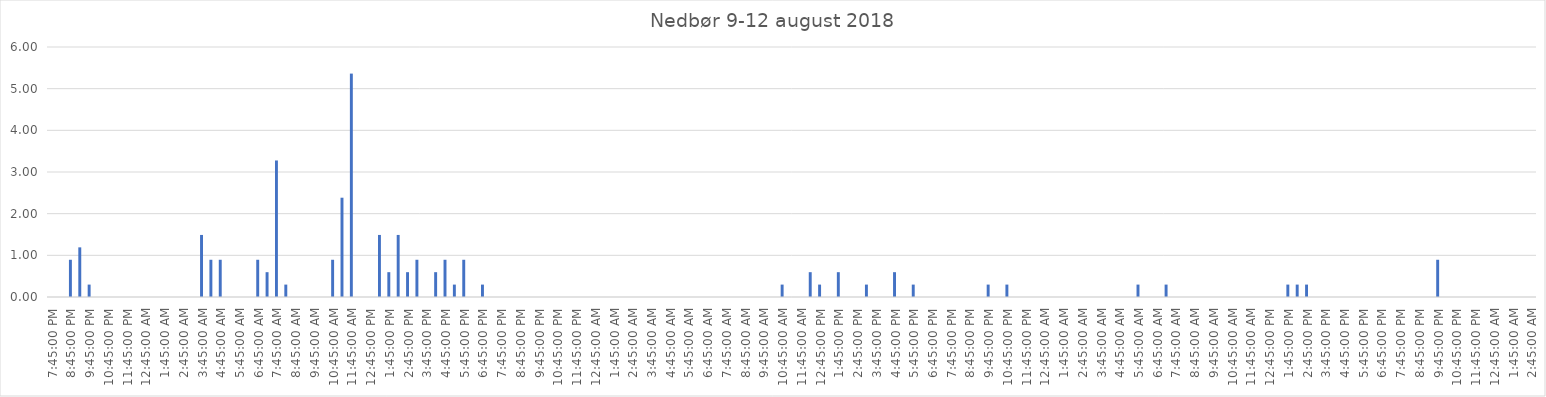
| Category | Series 0 |
|---|---|
| 0.8229166666666666 | 0 |
| 0.84375 | 0 |
| 0.8645833333333334 | 0.894 |
| 0.8854166666666667 | 1.191 |
| 0.9062500000000001 | 0.298 |
| 0.9270833333333335 | 0 |
| 0.9479166666666669 | 0 |
| 0.9687500000000002 | 0 |
| 0.9895833333333336 | 0 |
| 1900-01-01 00:15:00 | 0 |
| 1900-01-01 00:45:00 | 0 |
| 1900-01-01 01:15:00 | 0 |
| 1900-01-01 01:45:00 | 0 |
| 1900-01-01 02:15:00 | 0 |
| 1900-01-01 02:45:00 | 0 |
| 1900-01-01 03:15:00 | 0 |
| 1900-01-01 03:45:00 | 1.489 |
| 1900-01-01 04:15:00 | 0.894 |
| 1900-01-01 04:45:00 | 0.894 |
| 1900-01-01 05:15:00 | 0 |
| 1900-01-01 05:45:00 | 0 |
| 1900-01-01 06:15:00 | 0 |
| 1900-01-01 06:45:00 | 0.894 |
| 1900-01-01 07:15:00 | 0.596 |
| 1900-01-01 07:45:00 | 3.277 |
| 1900-01-01 08:15:00 | 0.298 |
| 1900-01-01 08:45:00 | 0 |
| 1900-01-01 09:15:00 | 0 |
| 1900-01-01 09:45:00 | 0 |
| 1900-01-01 10:15:00 | 0 |
| 1900-01-01 10:45:00 | 0.894 |
| 1900-01-01 11:15:00 | 2.383 |
| 1900-01-01 11:45:00 | 5.362 |
| 1900-01-01 12:15:00 | 0 |
| 1900-01-01 12:45:00 | 0 |
| 1900-01-01 13:15:00 | 1.489 |
| 1900-01-01 13:45:00 | 0.596 |
| 1900-01-01 14:15:00 | 1.489 |
| 1900-01-01 14:45:00 | 0.596 |
| 1900-01-01 15:15:00 | 0.894 |
| 1900-01-01 15:45:00 | 0 |
| 1900-01-01 16:15:00 | 0.596 |
| 1900-01-01 16:45:00 | 0.894 |
| 1900-01-01 17:15:00 | 0.298 |
| 1900-01-01 17:45:00 | 0.894 |
| 1900-01-01 18:15:00 | 0 |
| 1900-01-01 18:45:00 | 0.298 |
| 1900-01-01 19:15:00 | 0 |
| 1900-01-01 19:45:00 | 0 |
| 1900-01-01 20:15:00 | 0 |
| 1900-01-01 20:45:00 | 0 |
| 1900-01-01 21:15:00 | 0 |
| 1900-01-01 21:45:00 | 0 |
| 1900-01-01 22:15:00 | 0 |
| 1900-01-01 22:45:00 | 0 |
| 1900-01-01 23:15:00 | 0 |
| 1900-01-01 23:45:00 | 0 |
| 1900-01-02 00:15:00 | 0 |
| 1900-01-02 00:45:00 | 0 |
| 1900-01-02 01:15:00 | 0 |
| 1900-01-02 01:45:00 | 0 |
| 1900-01-02 02:15:00 | 0 |
| 1900-01-02 02:45:00 | 0 |
| 1900-01-02 03:15:00 | 0 |
| 1900-01-02 03:45:00 | 0 |
| 1900-01-02 04:15:00 | 0 |
| 1900-01-02 04:45:00 | 0 |
| 1900-01-02 05:15:00 | 0 |
| 1900-01-02 05:45:00 | 0 |
| 1900-01-02 06:15:00 | 0 |
| 1900-01-02 06:45:00 | 0 |
| 1900-01-02 07:15:00 | 0 |
| 1900-01-02 07:45:00 | 0 |
| 1900-01-02 08:15:00 | 0 |
| 1900-01-02 08:45:00 | 0 |
| 1900-01-02 09:15:00 | 0 |
| 1900-01-02 09:45:00 | 0 |
| 1900-01-02 10:15:00 | 0 |
| 1900-01-02 10:45:00 | 0.298 |
| 1900-01-02 11:15:00 | 0 |
| 1900-01-02 11:45:00 | 0 |
| 1900-01-02 12:15:00 | 0.596 |
| 1900-01-02 12:45:00 | 0.298 |
| 1900-01-02 13:15:00 | 0 |
| 1900-01-02 13:45:00 | 0.596 |
| 1900-01-02 14:15:00 | 0 |
| 1900-01-02 14:45:00 | 0 |
| 1900-01-02 15:15:00 | 0.298 |
| 1900-01-02 15:45:00 | 0 |
| 1900-01-02 16:15:00 | 0 |
| 1900-01-02 16:45:00 | 0.596 |
| 1900-01-02 17:15:00 | 0 |
| 1900-01-02 17:45:00 | 0.298 |
| 1900-01-02 18:15:00 | 0 |
| 1900-01-02 18:45:00 | 0 |
| 1900-01-02 19:15:00 | 0 |
| 1900-01-02 19:45:00 | 0 |
| 1900-01-02 20:15:00 | 0 |
| 1900-01-02 20:45:00 | 0 |
| 1900-01-02 21:15:00 | 0 |
| 1900-01-02 21:45:00 | 0.298 |
| 1900-01-02 22:15:00 | 0 |
| 1900-01-02 22:45:00 | 0.298 |
| 1900-01-02 23:15:00 | 0 |
| 1900-01-02 23:45:00 | 0 |
| 1900-01-03 00:15:00 | 0 |
| 1900-01-03 00:45:00 | 0 |
| 1900-01-03 01:15:00 | 0 |
| 1900-01-03 01:45:00 | 0 |
| 1900-01-03 02:15:00 | 0 |
| 1900-01-03 02:45:00 | 0 |
| 1900-01-03 03:15:00 | 0 |
| 1900-01-03 03:45:00 | 0 |
| 1900-01-03 04:15:00 | 0 |
| 1900-01-03 04:45:00 | 0 |
| 1900-01-03 05:15:00 | 0 |
| 1900-01-03 05:45:00 | 0.298 |
| 1900-01-03 06:15:00 | 0 |
| 1900-01-03 06:45:00 | 0 |
| 1900-01-03 07:15:00 | 0.298 |
| 1900-01-03 07:45:00 | 0 |
| 1900-01-03 08:15:00 | 0 |
| 1900-01-03 08:45:00 | 0 |
| 1900-01-03 09:15:00 | 0 |
| 1900-01-03 09:45:00 | 0 |
| 1900-01-03 10:15:00 | 0 |
| 1900-01-03 10:45:00 | 0 |
| 1900-01-03 11:15:00 | 0 |
| 1900-01-03 11:45:00 | 0 |
| 1900-01-03 12:15:00 | 0 |
| 1900-01-03 12:45:00 | 0 |
| 1900-01-03 13:15:00 | 0 |
| 1900-01-03 13:45:00 | 0.298 |
| 1900-01-03 14:15:00 | 0.298 |
| 1900-01-03 14:45:00 | 0.298 |
| 1900-01-03 15:15:00 | 0 |
| 1900-01-03 15:45:00 | 0 |
| 1900-01-03 16:15:00 | 0 |
| 1900-01-03 16:45:00 | 0 |
| 1900-01-03 17:15:00 | 0 |
| 1900-01-03 17:45:00 | 0 |
| 1900-01-03 18:15:00 | 0 |
| 1900-01-03 18:45:00 | 0 |
| 1900-01-03 19:15:00 | 0 |
| 1900-01-03 19:45:00 | 0 |
| 1900-01-03 20:15:00 | 0 |
| 1900-01-03 20:45:00 | 0 |
| 1900-01-03 21:15:00 | 0 |
| 1900-01-03 21:45:00 | 0.894 |
| 1900-01-03 22:15:00 | 0 |
| 1900-01-03 22:45:00 | 0 |
| 1900-01-03 23:15:00 | 0 |
| 1900-01-03 23:45:00 | 0 |
| 1900-01-04 00:15:00 | 0 |
| 1900-01-04 00:45:00 | 0 |
| 1900-01-04 01:15:00 | 0 |
| 1900-01-04 01:45:00 | 0 |
| 1900-01-04 02:15:00 | 0 |
| 1900-01-04 02:45:00 | 0 |